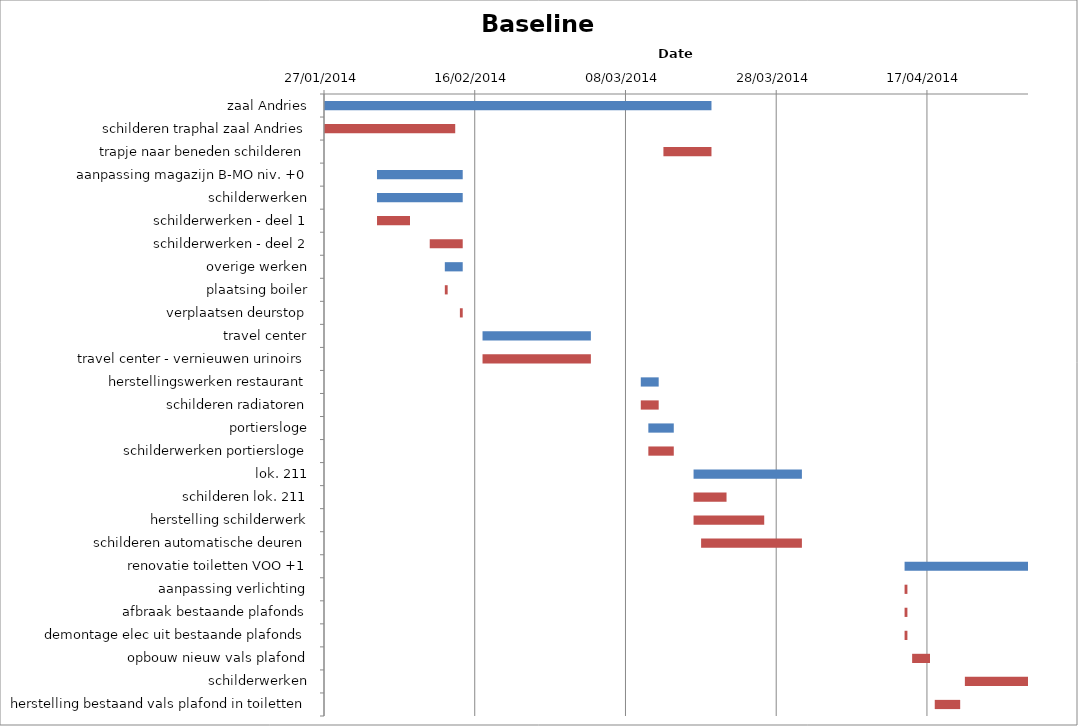
| Category | Baseline start | Actual duration |
|---|---|---|
| zaal Andries | 41666.333 | 51.375 |
| schilderen traphal zaal Andries | 41666.333 | 17.375 |
| trapje naar beneden schilderen | 41711.333 | 6.375 |
| aanpassing magazijn B-MO niv. +0 | 41673.333 | 11.375 |
| schilderwerken | 41673.333 | 11.375 |
| schilderwerken - deel 1 | 41673.333 | 4.375 |
| schilderwerken - deel 2 | 41680.333 | 4.375 |
| overige werken | 41682.333 | 2.375 |
| plaatsing boiler | 41682.333 | 0.375 |
| verplaatsen deurstop | 41684.333 | 0.375 |
| travel center | 41687.333 | 14.375 |
| travel center - vernieuwen urinoirs | 41687.333 | 14.375 |
| herstellingswerken restaurant | 41708.333 | 2.375 |
| schilderen radiatoren | 41708.333 | 2.375 |
| portiersloge | 41709.333 | 3.375 |
| schilderwerken portiersloge | 41709.333 | 3.375 |
| lok. 211 | 41715.333 | 14.375 |
| schilderen lok. 211 | 41715.333 | 4.375 |
| herstelling schilderwerk | 41715.333 | 9.375 |
| schilderen automatische deuren | 41716.333 | 13.375 |
| renovatie toiletten VOO +1 | 41743.333 | 16.375 |
| aanpassing verlichting | 41743.333 | 0.375 |
| afbraak bestaande plafonds | 41743.333 | 0.375 |
| demontage elec uit bestaande plafonds | 41743.333 | 0.375 |
| opbouw nieuw vals plafond | 41744.333 | 2.375 |
| schilderwerken | 41751.333 | 8.375 |
| herstelling bestaand vals plafond in toiletten | 41747.333 | 3.375 |